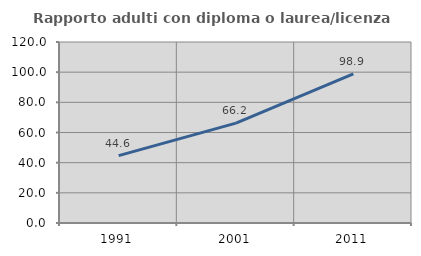
| Category | Rapporto adulti con diploma o laurea/licenza media  |
|---|---|
| 1991.0 | 44.643 |
| 2001.0 | 66.245 |
| 2011.0 | 98.921 |